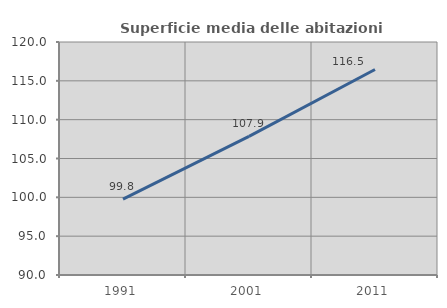
| Category | Superficie media delle abitazioni occupate |
|---|---|
| 1991.0 | 99.766 |
| 2001.0 | 107.854 |
| 2011.0 | 116.459 |